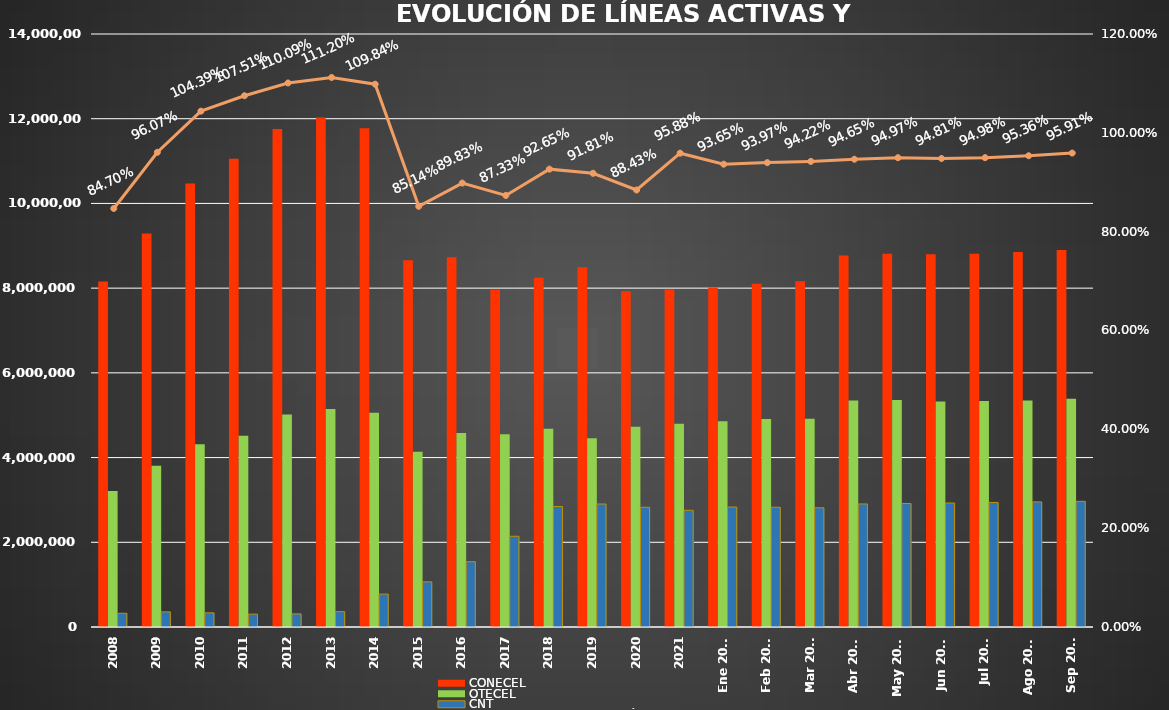
| Category | CONECEL | OTECEL | CNT |
|---|---|---|---|
| 2008 | 8156359 | 3211922 | 323967 |
| 2009 | 9291268 | 3806432 | 356900 |
| 2010 | 10470502 | 4314599 | 333730 |
| 2011 | 11057316 | 4513874 | 303368 |
| 2012 | 11757906 | 5019686 | 309271 |
| 2013 | 12030886 | 5148308 | 362560 |
| 2014 | 11772020 | 5055645 | 776892 |
| 2015 | 8658619 | 4134698 | 1065703 |
| 2016 | 8726823 | 4580092 | 1541219 |
| 2017 | 7960263 | 4549024 | 2142117 |
| 2018 | 8248050 | 4679646 | 2845142 |
| 2019 | 8493054 | 4456356 | 2903690 |
| 2020 | 7929253 | 4729725 | 2826388 |
| 2021 | 7965274 | 4800608 | 2755177 |
| Ene 2022 | 8012894 | 4856877 | 2831764 |
| Feb 2022 | 8103873 | 4909433 | 2827246 |
| Mar 2022 | 8163884 | 4915830 | 2814894 |
| Abr 2022 | 8773356 | 5349789 | 2904652 |
| May 2022 | 8810418 | 5358332 | 2916052 |
| Jun 2022 | 8802391 | 5326606 | 2926942 |
| Jul 2022 | 8811432 | 5334228 | 2940353 |
| Ago 2022 | 8855909 | 5345771 | 2954002 |
| Sep 2022 | 8900276 | 5386355 | 2967003 |